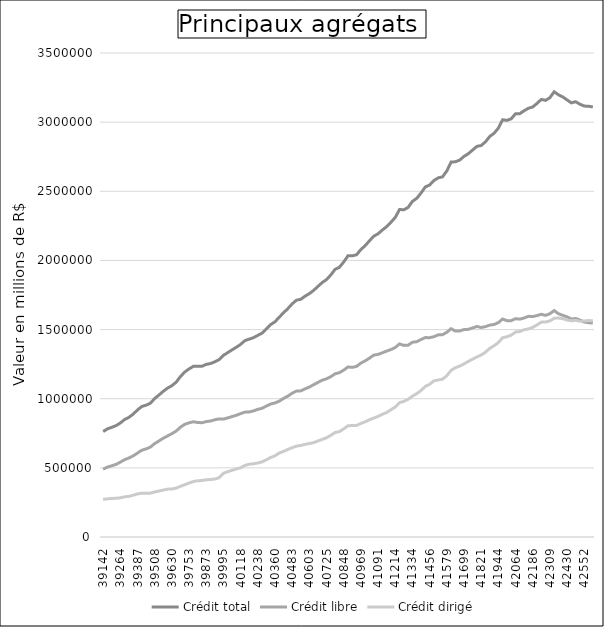
| Category | Crédit total | Crédit libre | Crédit dirigé |
|---|---|---|---|
| 39142.0 | 762353 | 490460 | 271893 |
| 39173.0 | 781888 | 505753 | 276135 |
| 39203.0 | 793133 | 514647 | 278486 |
| 39234.0 | 805488 | 525046 | 280442 |
| 39264.0 | 824442 | 541348 | 283093 |
| 39295.0 | 849829 | 559351 | 290477 |
| 39326.0 | 865511 | 571372 | 294138 |
| 39356.0 | 889035 | 586902 | 302134 |
| 39387.0 | 918815 | 607215 | 311599 |
| 39417.0 | 943922 | 627514 | 316407 |
| 39448.0 | 953413 | 637031 | 316383 |
| 39479.0 | 967443 | 650206 | 317237 |
| 39508.0 | 1001598 | 675746 | 325853 |
| 39539.0 | 1026847 | 694533 | 332314 |
| 39569.0 | 1053889 | 714469 | 339420 |
| 39600.0 | 1076833 | 730738 | 346095 |
| 39630.0 | 1094368 | 747211 | 347158 |
| 39661.0 | 1119457 | 765976 | 353481 |
| 39692.0 | 1160687 | 794301 | 366386 |
| 39722.0 | 1193073 | 814746 | 378327 |
| 39753.0 | 1215779 | 825652 | 390127 |
| 39783.0 | 1233987 | 833190 | 400798 |
| 39814.0 | 1235244 | 828359 | 406883 |
| 39845.0 | 1234825 | 826524 | 408301 |
| 39873.0 | 1248303 | 834475 | 413828 |
| 39904.0 | 1254564 | 838679 | 415885 |
| 39934.0 | 1266918 | 847745 | 419172 |
| 39965.0 | 1282923 | 854231 | 428691 |
| 39995.0 | 1313534 | 852380 | 461154 |
| 40026.0 | 1333320 | 861333 | 471987 |
| 40057.0 | 1353111 | 870856 | 482255 |
| 40087.0 | 1372244 | 879979 | 492264 |
| 40118.0 | 1392918 | 892321 | 500596 |
| 40148.0 | 1420515 | 902959 | 517557 |
| 40179.0 | 1430550 | 904156 | 526393 |
| 40210.0 | 1441519 | 912036 | 529483 |
| 40238.0 | 1458091 | 922991 | 535100 |
| 40269.0 | 1474310 | 931127 | 543183 |
| 40299.0 | 1505517 | 946955 | 558562 |
| 40330.0 | 1536422 | 961569 | 574855 |
| 40360.0 | 1556280 | 969380 | 586899 |
| 40391.0 | 1589856 | 982429 | 607428 |
| 40422.0 | 1621541 | 1002374 | 619166 |
| 40452.0 | 1651813 | 1018637 | 633176 |
| 40483.0 | 1685712 | 1039882 | 645830 |
| 40513.0 | 1712708 | 1055664 | 657044 |
| 40544.0 | 1718711 | 1056671 | 662040 |
| 40575.0 | 1741509 | 1071299 | 670209 |
| 40603.0 | 1759678 | 1084265 | 675414 |
| 40634.0 | 1783487 | 1101045 | 682442 |
| 40664.0 | 1812128 | 1117780 | 694348 |
| 40695.0 | 1840157 | 1134168 | 705989 |
| 40725.0 | 1861598 | 1144039 | 717559 |
| 40756.0 | 1894713 | 1159266 | 735447 |
| 40787.0 | 1935781 | 1180214 | 755567 |
| 40817.0 | 1950658 | 1188415 | 762243 |
| 40848.0 | 1988613 | 1206785 | 781828 |
| 40878.0 | 2033954 | 1229709 | 804244 |
| 40909.0 | 2033185 | 1226584 | 806601 |
| 40940.0 | 2041040 | 1233889 | 807151 |
| 40969.0 | 2078912 | 1257701 | 821211 |
| 41000.0 | 2106585 | 1273633 | 832953 |
| 41030.0 | 2142061 | 1293614 | 848447 |
| 41061.0 | 2175135 | 1315148 | 859987 |
| 41091.0 | 2192888 | 1320395 | 872492 |
| 41122.0 | 2219866 | 1332171 | 887695 |
| 41153.0 | 2244474 | 1344490 | 899984 |
| 41183.0 | 2276286 | 1355709 | 920576 |
| 41214.0 | 2310841 | 1370441 | 940400 |
| 41244.0 | 2368338 | 1396377 | 971961 |
| 41275.0 | 2366165 | 1385487 | 980678 |
| 41306.0 | 2383597 | 1387303 | 996294 |
| 41334.0 | 2427062 | 1408474 | 1018588 |
| 41365.0 | 2449147 | 1412384 | 1036764 |
| 41395.0 | 2487294 | 1428386 | 1058908 |
| 41426.0 | 2531576 | 1442005 | 1089571 |
| 41456.0 | 2545127 | 1441307 | 1103820 |
| 41487.0 | 2577874 | 1448585 | 1129289 |
| 41518.0 | 2597168 | 1461803 | 1135365 |
| 41548.0 | 2604241 | 1463014 | 1141227 |
| 41579.0 | 2646873 | 1480598 | 1166274 |
| 41609.0 | 2711371 | 1506243 | 1205128 |
| 41640.0 | 2713271 | 1489081 | 1224191 |
| 41671.0 | 2725652 | 1489949 | 1235703 |
| 41699.0 | 2752289 | 1500416 | 1251872 |
| 41730.0 | 2771347 | 1501623 | 1269724 |
| 41760.0 | 2798015 | 1511736 | 1286279 |
| 41791.0 | 2824626 | 1522551 | 1302075 |
| 41821.0 | 2830844 | 1515021 | 1315824 |
| 41852.0 | 2857674 | 1521291 | 1336383 |
| 41883.0 | 2896570 | 1532331 | 1364239 |
| 41913.0 | 2919447 | 1536632 | 1382814 |
| 41944.0 | 2956599 | 1550375 | 1406225 |
| 41974.0 | 3017456 | 1576209 | 1441247 |
| 42005.0 | 3012721 | 1564550 | 1448172 |
| 42036.0 | 3024316 | 1564665 | 1459652 |
| 42064.0 | 3060731 | 1578429 | 1482302 |
| 42095.0 | 3061492 | 1575472 | 1486019 |
| 42125.0 | 3082430 | 1583614 | 1498816 |
| 42156.0 | 3100422 | 1595865 | 1504557 |
| 42186.0 | 3109646 | 1593795 | 1515850 |
| 42217.0 | 3135187 | 1601290 | 1533897 |
| 42248.0 | 3164300 | 1610511 | 1553788 |
| 42278.0 | 3157420 | 1602806 | 1554614 |
| 42309.0 | 3177029 | 1614640 | 1562389 |
| 42339.0 | 3219473 | 1637313 | 1582159 |
| 42370.0 | 3197924 | 1614333 | 1583591 |
| 42401.0 | 3182317 | 1602964 | 1579353 |
| 42430.0 | 3160571 | 1592043 | 1568527 |
| 42461.0 | 3139548 | 1575942 | 1563606 |
| 42491.0 | 3147609 | 1580487 | 1567122 |
| 42522.0 | 3129648 | 1569124 | 1560524 |
| 42552.0 | 3116244 | 1554284 | 1561960 |
| 42583.0 | 3114926 | 1549725 | 1565201 |
| 42614.0 | 3109887 | 1547069 | 1562818 |